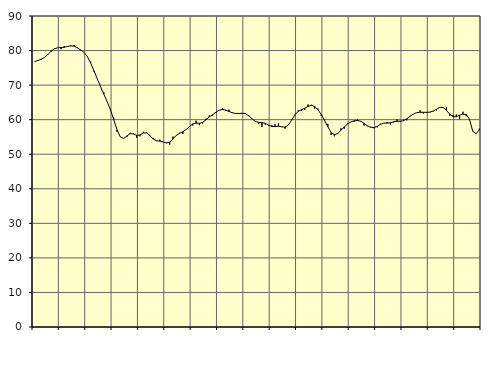
| Category | Piggar | Series 1 |
|---|---|---|
| nan | 76.9 | 76.83 |
| 87.0 | 77.1 | 77.13 |
| 87.0 | 77.3 | 77.5 |
| 87.0 | 78 | 78.01 |
| nan | 79 | 78.84 |
| 88.0 | 79.6 | 79.8 |
| 88.0 | 80.6 | 80.5 |
| 88.0 | 80.8 | 80.8 |
| nan | 80.4 | 80.86 |
| 89.0 | 81.3 | 80.95 |
| 89.0 | 81.1 | 81.18 |
| 89.0 | 81.5 | 81.36 |
| nan | 81.6 | 81.27 |
| 90.0 | 80.7 | 80.8 |
| 90.0 | 79.9 | 80.17 |
| 90.0 | 79.4 | 79.45 |
| nan | 78.3 | 78.25 |
| 91.0 | 76.8 | 76.39 |
| 91.0 | 73.9 | 74.16 |
| 91.0 | 71.9 | 71.86 |
| nan | 69.7 | 69.59 |
| 92.0 | 67.9 | 67.37 |
| 92.0 | 65.2 | 65.24 |
| 92.0 | 63.1 | 62.89 |
| nan | 60.6 | 60.02 |
| 93.0 | 56.5 | 57.1 |
| 93.0 | 55 | 55.03 |
| 93.0 | 54.5 | 54.56 |
| nan | 55 | 55.28 |
| 94.0 | 56.2 | 55.96 |
| 94.0 | 56.1 | 55.86 |
| 94.0 | 54.8 | 55.44 |
| nan | 55.2 | 55.59 |
| 95.0 | 56.5 | 56.15 |
| 95.0 | 56.4 | 56.19 |
| 95.0 | 55.5 | 55.36 |
| nan | 54.7 | 54.37 |
| 96.0 | 53.8 | 53.9 |
| 96.0 | 54.2 | 53.79 |
| 96.0 | 53.6 | 53.57 |
| nan | 53.4 | 53.26 |
| 97.0 | 52.8 | 53.49 |
| 97.0 | 55.1 | 54.42 |
| 97.0 | 55.5 | 55.43 |
| nan | 56.2 | 56.05 |
| 98.0 | 55.9 | 56.51 |
| 98.0 | 57.2 | 57.16 |
| 98.0 | 58.1 | 58 |
| nan | 58.3 | 58.78 |
| 99.0 | 59.7 | 58.99 |
| 99.0 | 58.4 | 58.94 |
| 99.0 | 58.9 | 59.2 |
| nan | 60.3 | 59.95 |
| 0.0 | 61.2 | 60.8 |
| 0.0 | 61.2 | 61.42 |
| 0.0 | 61.9 | 62.13 |
| nan | 62.8 | 62.73 |
| 1.0 | 63.3 | 62.94 |
| 1.0 | 62.5 | 62.77 |
| 1.0 | 62.9 | 62.37 |
| nan | 62.1 | 62 |
| 2.0 | 61.9 | 61.8 |
| 2.0 | 61.8 | 61.8 |
| 2.0 | 61.9 | 61.88 |
| nan | 61.9 | 61.73 |
| 3.0 | 61 | 61.17 |
| 3.0 | 60.3 | 60.26 |
| 3.0 | 59.4 | 59.5 |
| nan | 58.7 | 59.22 |
| 4.0 | 57.9 | 59.13 |
| 4.0 | 58.6 | 58.92 |
| 4.0 | 58.3 | 58.45 |
| nan | 58.4 | 58.02 |
| 5.0 | 58.7 | 57.99 |
| 5.0 | 58.9 | 58.09 |
| 5.0 | 58 | 57.95 |
| nan | 57.4 | 57.83 |
| 6.0 | 58.4 | 58.41 |
| 6.0 | 60 | 59.82 |
| 6.0 | 61.5 | 61.41 |
| nan | 62.7 | 62.4 |
| 7.0 | 62.5 | 62.87 |
| 7.0 | 62.8 | 63.3 |
| 7.0 | 64.4 | 63.85 |
| nan | 64.3 | 64.17 |
| 8.0 | 63.2 | 63.82 |
| 8.0 | 63.2 | 62.88 |
| 8.0 | 61.1 | 61.5 |
| nan | 60 | 59.83 |
| 9.0 | 58.8 | 57.93 |
| 9.0 | 55.6 | 56.31 |
| 9.0 | 55.2 | 55.62 |
| nan | 55.8 | 56.01 |
| 10.0 | 57.5 | 56.93 |
| 10.0 | 57.4 | 57.91 |
| 10.0 | 59 | 58.72 |
| nan | 59.4 | 59.34 |
| 11.0 | 59.4 | 59.68 |
| 11.0 | 60.1 | 59.77 |
| 11.0 | 59.6 | 59.54 |
| nan | 58.3 | 58.92 |
| 12.0 | 58.1 | 58.24 |
| 12.0 | 57.9 | 57.79 |
| 12.0 | 57.5 | 57.73 |
| nan | 57.8 | 58.07 |
| 13.0 | 58.8 | 58.66 |
| 13.0 | 59 | 59.01 |
| 13.0 | 59.3 | 59 |
| nan | 58.6 | 59.11 |
| 14.0 | 59.2 | 59.39 |
| 14.0 | 60.1 | 59.56 |
| 14.0 | 59.3 | 59.55 |
| nan | 60 | 59.7 |
| 15.0 | 59.8 | 60.27 |
| 15.0 | 61.1 | 61 |
| 15.0 | 61.6 | 61.64 |
| nan | 62 | 62.04 |
| 16.0 | 62.7 | 62.14 |
| 16.0 | 61.8 | 62.13 |
| 16.0 | 62 | 62.12 |
| nan | 62.1 | 62.2 |
| 17.0 | 62.4 | 62.49 |
| 17.0 | 62.7 | 63.02 |
| 17.0 | 63.6 | 63.56 |
| nan | 63.4 | 63.54 |
| 18.0 | 63.7 | 62.71 |
| 18.0 | 61.1 | 61.61 |
| 18.0 | 61.3 | 60.87 |
| nan | 61.5 | 60.86 |
| 19.0 | 60.1 | 61.31 |
| 19.0 | 62.3 | 61.61 |
| 19.0 | 61 | 61.51 |
| nan | 60.1 | 60.12 |
| 20.0 | 56.7 | 56.64 |
| 20.0 | 55.8 | 55.95 |
| 20.0 | 57.4 | 57.03 |